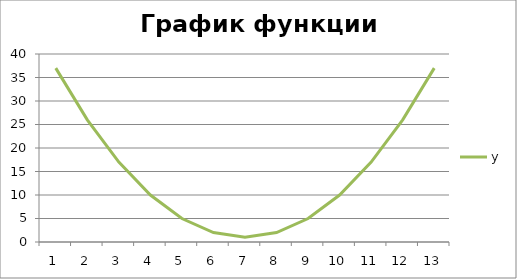
| Category | y |
|---|---|
| 0 | 37 |
| 1 | 26 |
| 2 | 17 |
| 3 | 10 |
| 4 | 5 |
| 5 | 2 |
| 6 | 1 |
| 7 | 2 |
| 8 | 5 |
| 9 | 10 |
| 10 | 17 |
| 11 | 26 |
| 12 | 37 |